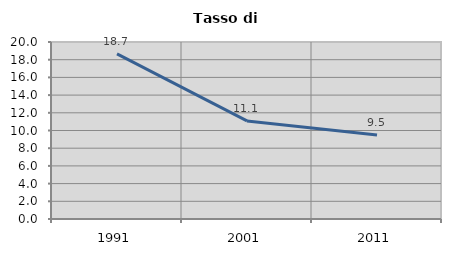
| Category | Tasso di disoccupazione   |
|---|---|
| 1991.0 | 18.65 |
| 2001.0 | 11.081 |
| 2011.0 | 9.491 |